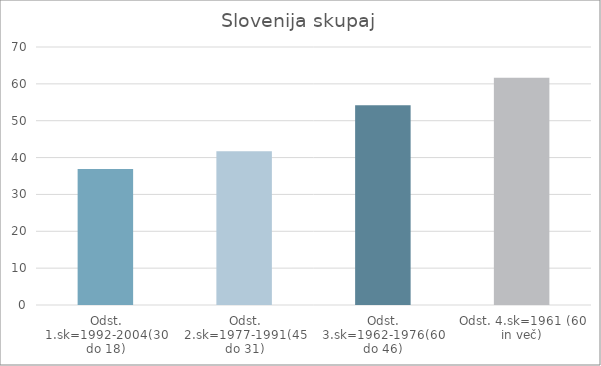
| Category | Series 0 |
|---|---|
| Odst. 1.sk=1992-2004(30 do 18) | 36.92 |
| Odst. 2.sk=1977-1991(45 do 31) | 41.71 |
| Odst. 3.sk=1962-1976(60 do 46) | 54.21 |
| Odst. 4.sk=1961 (60 in več) | 61.69 |